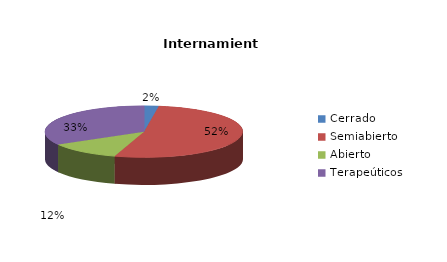
| Category | Series 0 |
|---|---|
| Cerrado | 1 |
| Semiabierto | 22 |
| Abierto | 5 |
| Terapeúticos | 14 |